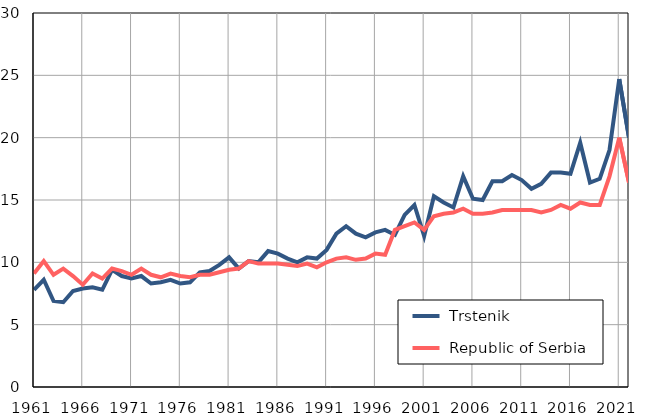
| Category |  Trstenik |  Republic of Serbia |
|---|---|---|
| 1961.0 | 7.8 | 9.1 |
| 1962.0 | 8.6 | 10.1 |
| 1963.0 | 6.9 | 9 |
| 1964.0 | 6.8 | 9.5 |
| 1965.0 | 7.7 | 8.9 |
| 1966.0 | 7.9 | 8.2 |
| 1967.0 | 8 | 9.1 |
| 1968.0 | 7.8 | 8.7 |
| 1969.0 | 9.4 | 9.5 |
| 1970.0 | 8.9 | 9.3 |
| 1971.0 | 8.7 | 9 |
| 1972.0 | 8.9 | 9.5 |
| 1973.0 | 8.3 | 9 |
| 1974.0 | 8.4 | 8.8 |
| 1975.0 | 8.6 | 9.1 |
| 1976.0 | 8.3 | 8.9 |
| 1977.0 | 8.4 | 8.8 |
| 1978.0 | 9.2 | 9 |
| 1979.0 | 9.3 | 9 |
| 1980.0 | 9.8 | 9.2 |
| 1981.0 | 10.4 | 9.4 |
| 1982.0 | 9.5 | 9.5 |
| 1983.0 | 10.1 | 10.1 |
| 1984.0 | 10 | 9.9 |
| 1985.0 | 10.9 | 9.9 |
| 1986.0 | 10.7 | 9.9 |
| 1987.0 | 10.3 | 9.8 |
| 1988.0 | 10 | 9.7 |
| 1989.0 | 10.4 | 9.9 |
| 1990.0 | 10.3 | 9.6 |
| 1991.0 | 11 | 10 |
| 1992.0 | 12.3 | 10.3 |
| 1993.0 | 12.9 | 10.4 |
| 1994.0 | 12.3 | 10.2 |
| 1995.0 | 12 | 10.3 |
| 1996.0 | 12.4 | 10.7 |
| 1997.0 | 12.6 | 10.6 |
| 1998.0 | 12.2 | 12.6 |
| 1999.0 | 13.8 | 12.9 |
| 2000.0 | 14.6 | 13.2 |
| 2001.0 | 12.1 | 12.6 |
| 2002.0 | 15.3 | 13.7 |
| 2003.0 | 14.8 | 13.9 |
| 2004.0 | 14.4 | 14 |
| 2005.0 | 16.9 | 14.3 |
| 2006.0 | 15.1 | 13.9 |
| 2007.0 | 15 | 13.9 |
| 2008.0 | 16.5 | 14 |
| 2009.0 | 16.5 | 14.2 |
| 2010.0 | 17 | 14.2 |
| 2011.0 | 16.6 | 14.2 |
| 2012.0 | 15.9 | 14.2 |
| 2013.0 | 16.3 | 14 |
| 2014.0 | 17.2 | 14.2 |
| 2015.0 | 17.2 | 14.6 |
| 2016.0 | 17.1 | 14.3 |
| 2017.0 | 19.6 | 14.8 |
| 2018.0 | 16.4 | 14.6 |
| 2019.0 | 16.7 | 14.6 |
| 2020.0 | 19 | 16.9 |
| 2021.0 | 24.7 | 20 |
| 2022.0 | 20 | 16.4 |